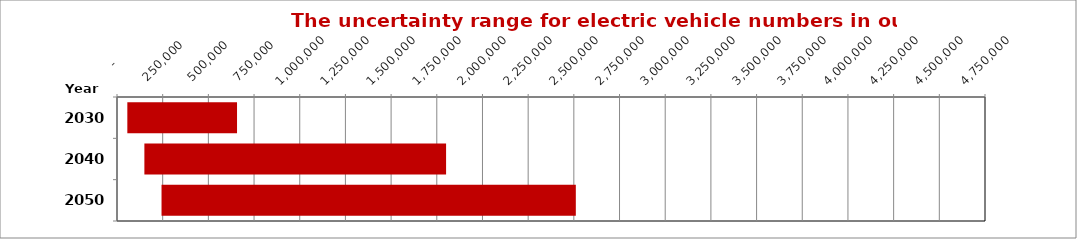
| Category | Min | Inc |
|---|---|---|
| 2030.0 | 56546 | 600320 |
| 2040.0 | 149840 | 1651013 |
| 2050.0 | 243710 | 2267106 |